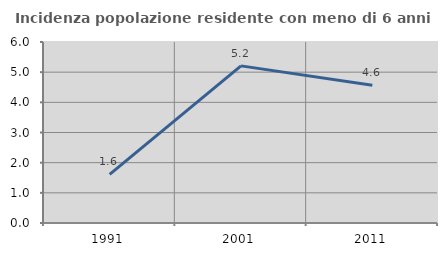
| Category | Incidenza popolazione residente con meno di 6 anni |
|---|---|
| 1991.0 | 1.613 |
| 2001.0 | 5.208 |
| 2011.0 | 4.569 |